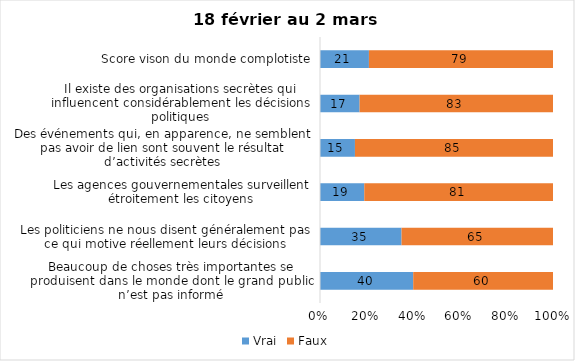
| Category | Vrai | Faux |
|---|---|---|
| Beaucoup de choses très importantes se produisent dans le monde dont le grand public n’est pas informé | 40 | 60 |
| Les politiciens ne nous disent généralement pas ce qui motive réellement leurs décisions | 35 | 65 |
| Les agences gouvernementales surveillent étroitement les citoyens | 19 | 81 |
| Des événements qui, en apparence, ne semblent pas avoir de lien sont souvent le résultat d’activités secrètes | 15 | 85 |
| Il existe des organisations secrètes qui influencent considérablement les décisions politiques | 17 | 83 |
| Score vison du monde complotiste | 21 | 79 |